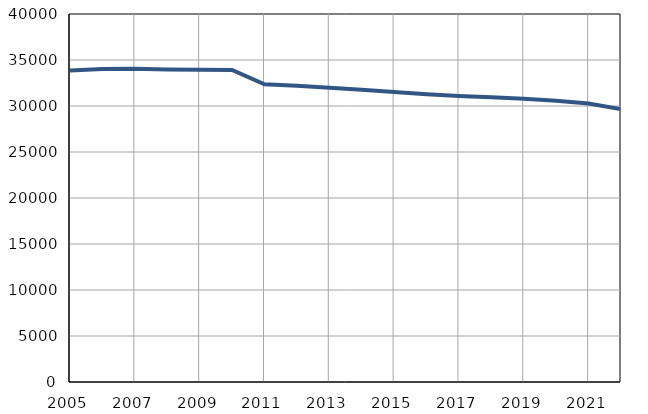
| Category | Population
size |
|---|---|
| 2005.0 | 33847 |
| 2006.0 | 34016 |
| 2007.0 | 34062 |
| 2008.0 | 33966 |
| 2009.0 | 33931 |
| 2010.0 | 33913 |
| 2011.0 | 32353 |
| 2012.0 | 32197 |
| 2013.0 | 31988 |
| 2014.0 | 31759 |
| 2015.0 | 31510 |
| 2016.0 | 31269 |
| 2017.0 | 31091 |
| 2018.0 | 30939 |
| 2019.0 | 30795 |
| 2020.0 | 30575 |
| 2021.0 | 30268 |
| 2022.0 | 29648 |